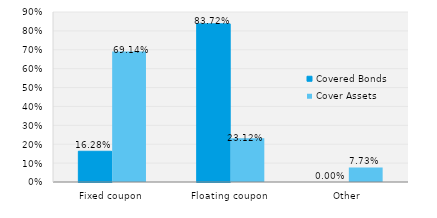
| Category | Covered Bonds | Cover Assets |
|---|---|---|
| Fixed coupon | 0.163 | 0.691 |
| Floating coupon | 0.837 | 0.231 |
| Other | 0 | 0.077 |